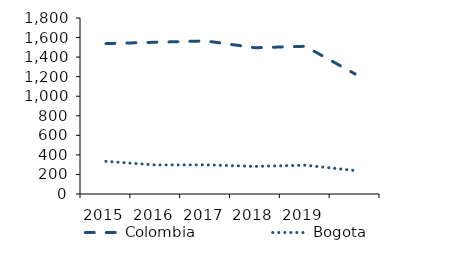
| Category | Colombia | Bogota |
|---|---|---|
| 2015.0 | 1538.024 | 333.805 |
| 2016.0 | 1552.069 | 297.093 |
| 2017.0 | 1565.465 | 298.267 |
| 2018.0 | 1495.737 | 282.25 |
| 2019.0 | 1510.82 | 294.454 |